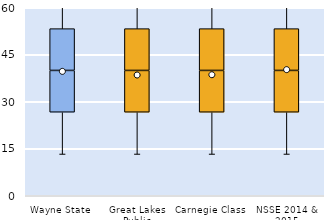
| Category | 25th | 50th | 75th |
|---|---|---|---|
| Wayne State | 26.667 | 13.333 | 13.333 |
| Great Lakes Public | 26.667 | 13.333 | 13.333 |
| Carnegie Class | 26.667 | 13.333 | 13.333 |
| NSSE 2014 & 2015 | 26.667 | 13.333 | 13.333 |